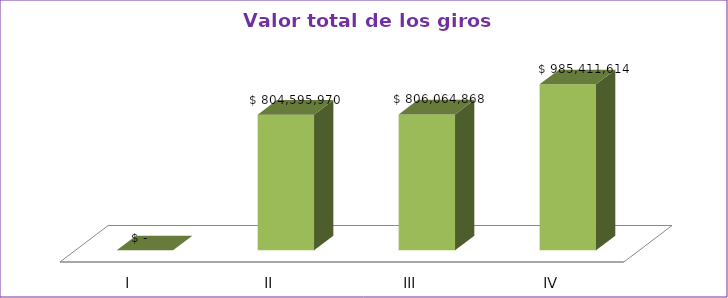
| Category | Series 0 |
|---|---|
| I | 0 |
| II | 804595970 |
| III | 806064868 |
| IV | 985411614 |